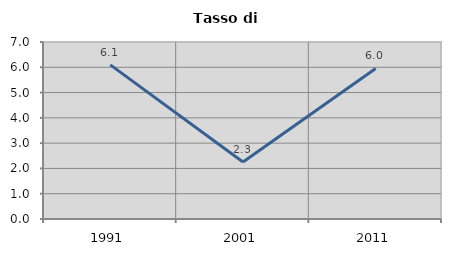
| Category | Tasso di disoccupazione   |
|---|---|
| 1991.0 | 6.096 |
| 2001.0 | 2.256 |
| 2011.0 | 5.952 |